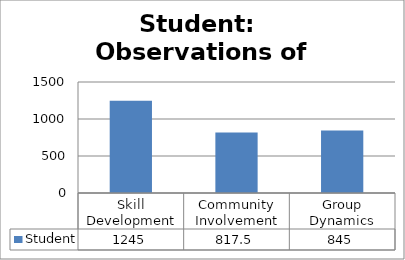
| Category | Student |
|---|---|
| Skill Development | 1245 |
| Community Involvement | 817.5 |
| Group Dynamics | 845 |